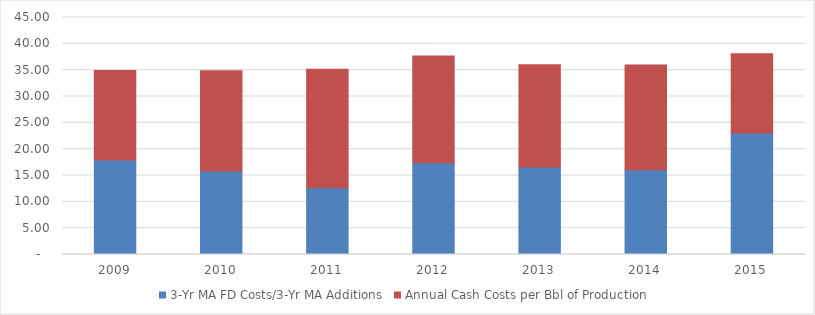
| Category | 3-Yr MA FD Costs/3-Yr MA Additions | Annual Cash Costs per Bbl of Production  |
|---|---|---|
| 2009.0 | 17.965 | 16.97 |
| 2010.0 | 15.875 | 19.02 |
| 2011.0 | 12.682 | 22.508 |
| 2012.0 | 17.409 | 20.261 |
| 2013.0 | 16.631 | 19.404 |
| 2014.0 | 16.096 | 19.905 |
| 2015.0 | 23.057 | 15.077 |